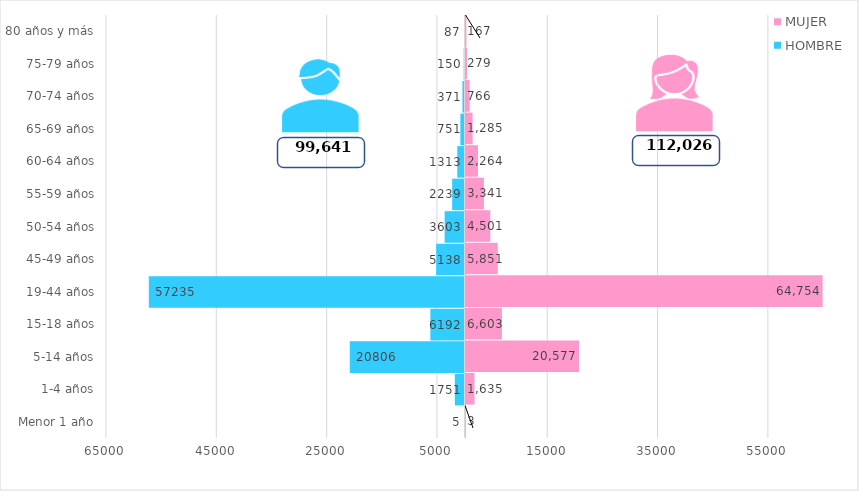
| Category | HOMBRE | MUJER |
|---|---|---|
| Menor 1 año | -5 | 3 |
| 1-4 años | -1751 | 1635 |
| 5-14 años | -20806 | 20577 |
| 15-18 años | -6192 | 6603 |
| 19-44 años | -57235 | 64754 |
| 45-49 años | -5138 | 5851 |
| 50-54 años | -3603 | 4501 |
| 55-59 años | -2239 | 3341 |
| 60-64 años | -1313 | 2264 |
| 65-69 años | -751 | 1285 |
| 70-74 años | -371 | 766 |
| 75-79 años | -150 | 279 |
| 80 años y más | -87 | 167 |